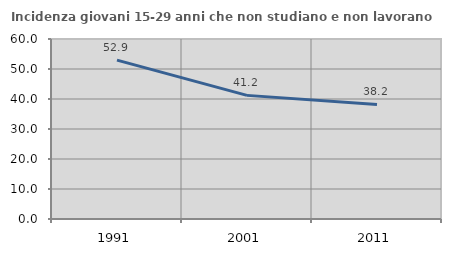
| Category | Incidenza giovani 15-29 anni che non studiano e non lavorano  |
|---|---|
| 1991.0 | 52.941 |
| 2001.0 | 41.209 |
| 2011.0 | 38.168 |